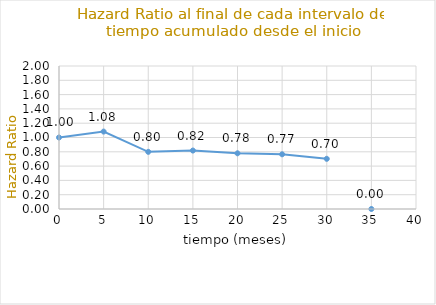
| Category | HRi |
|---|---|
| 0.0 | 1 |
| 5.0 | 1.083 |
| 10.0 | 0.799 |
| 15.0 | 0.818 |
| 20.0 | 0.779 |
| 25.0 | 0.765 |
| 30.0 | 0.702 |
| 35.0 | 0 |